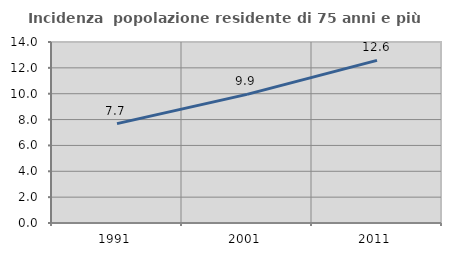
| Category | Incidenza  popolazione residente di 75 anni e più |
|---|---|
| 1991.0 | 7.685 |
| 2001.0 | 9.947 |
| 2011.0 | 12.582 |